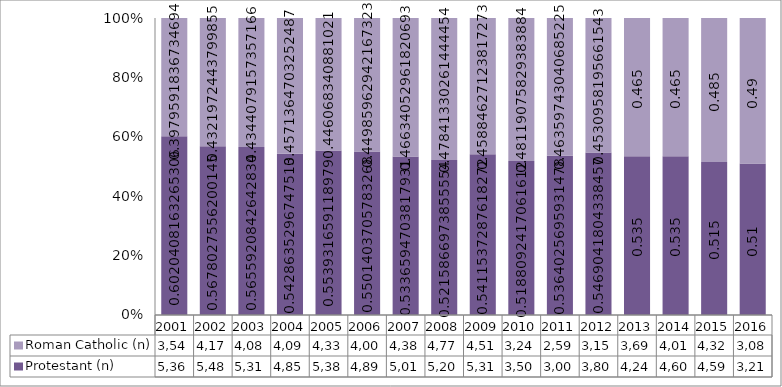
| Category | Protestant (n) | Roman Catholic (n) |
|---|---|---|
| 2001.0 | 5369 | 3549 |
| 2002.0 | 5481 | 4172 |
| 2003.0 | 5316 | 4083 |
| 2004.0 | 4857 | 4090 |
| 2005.0 | 5382 | 4334 |
| 2006.0 | 4899 | 4006 |
| 2007.0 | 5018 | 4385 |
| 2008.0 | 5207 | 4776 |
| 2009.0 | 5319 | 4510 |
| 2010.0 | 3503 | 3249 |
| 2011.0 | 3006 | 2598 |
| 2012.0 | 3807 | 3154 |
| 2013.0 | 4247 | 3695 |
| 2014.0 | 4607 | 4011 |
| 2015.0 | 4596 | 4328 |
| 2016.0 | 3217 | 3088 |